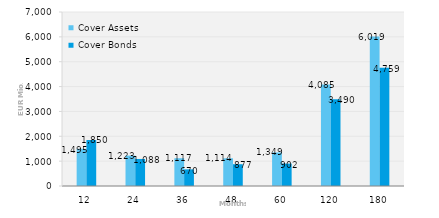
| Category | Cover Assets | Cover Bonds |
|---|---|---|
| 12.0 | 1495.091 | 1849.613 |
| 24.0 | 1222.575 | 1087.514 |
| 36.0 | 1116.889 | 669.7 |
| 48.0 | 1114.096 | 877.015 |
| 60.0 | 1348.614 | 901.8 |
| 120.0 | 4085.155 | 3489.96 |
| 180.0 | 6018.528 | 4759.244 |